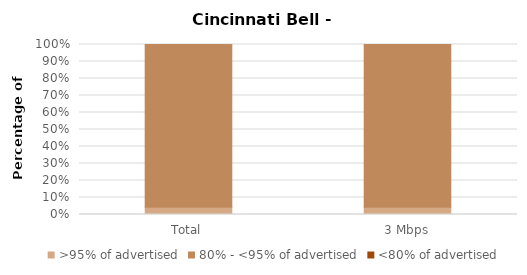
| Category | >95% of advertised | 80% - <95% of advertised | <80% of advertised |
|---|---|---|---|
| Total | 0.043 | 0.957 | 0 |
| 3 Mbps | 0.043 | 0.957 | 0 |